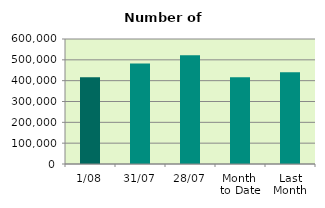
| Category | Series 0 |
|---|---|
| 1/08 | 416364 |
| 31/07 | 482186 |
| 28/07 | 521936 |
| Month 
to Date | 416364 |
| Last
Month | 440756.667 |